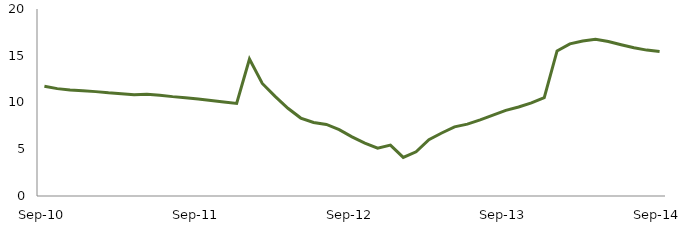
| Category | Series 0 |
|---|---|
| Sep-10 | 11.747 |
|  | 11.483 |
|  | 11.344 |
|  | 11.256 |
|  | 11.163 |
|  | 11.031 |
|  | 10.935 |
|  | 10.818 |
|  | 10.872 |
|  | 10.784 |
|  | 10.628 |
|  | 10.504 |
| Sep-11 | 10.374 |
|  | 10.212 |
|  | 10.043 |
|  | 9.898 |
|  | 14.655 |
|  | 12.038 |
|  | 10.656 |
|  | 9.383 |
|  | 8.337 |
|  | 7.859 |
|  | 7.654 |
|  | 7.095 |
| Sep-12 | 6.329 |
|  | 5.655 |
|  | 5.108 |
|  | 5.447 |
|  | 4.125 |
|  | 4.723 |
|  | 6.024 |
|  | 6.741 |
|  | 7.399 |
|  | 7.69 |
|  | 8.139 |
|  | 8.641 |
| Sep-13 | 9.159 |
|  | 9.523 |
|  | 9.953 |
|  | 10.521 |
|  | 15.512 |
|  | 16.267 |
|  | 16.584 |
|  | 16.774 |
|  | 16.523 |
|  | 16.177 |
|  | 15.851 |
|  | 15.603 |
| Sep-14 | 15.444 |